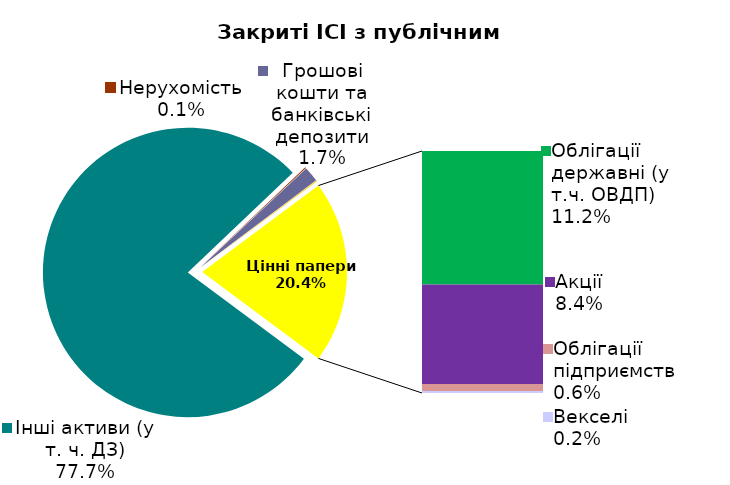
| Category | Series 0 |
|---|---|
| Інші активи (у т. ч. ДЗ) | 0.777 |
| Нерухомість | 0.001 |
| Грошові кошти та банківські депозити | 0.017 |
| Банківські метали | 0.001 |
| Облігації державні (у т.ч. ОВДП) | 0.112 |
| Акції | 0.084 |
| Облігації підприємств | 0.006 |
| Векселі | 0.002 |